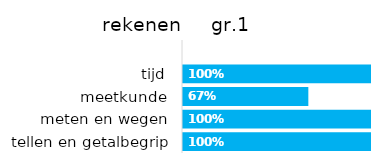
| Category | rekenen gr.1 |
|---|---|
| tellen en getalbegrip | 1 |
| meten en wegen | 1 |
| meetkunde | 0.667 |
| tijd | 1 |